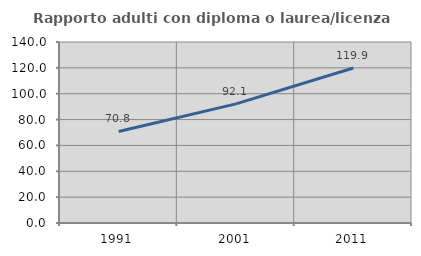
| Category | Rapporto adulti con diploma o laurea/licenza media  |
|---|---|
| 1991.0 | 70.795 |
| 2001.0 | 92.135 |
| 2011.0 | 119.914 |